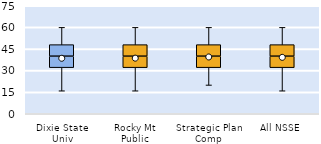
| Category | 25th | 50th | 75th |
|---|---|---|---|
| Dixie State Univ | 32 | 8 | 8 |
| Rocky Mt Public | 32 | 8 | 8 |
| Strategic Plan Comp | 32 | 8 | 8 |
| All NSSE | 32 | 8 | 8 |